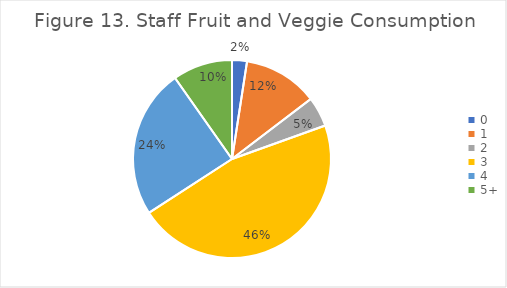
| Category | Series 0 |
|---|---|
| 0 | 0.024 |
| 1 | 0.122 |
| 2 | 0.049 |
| 3 | 0.463 |
| 4 | 0.244 |
| 5+ | 0.098 |